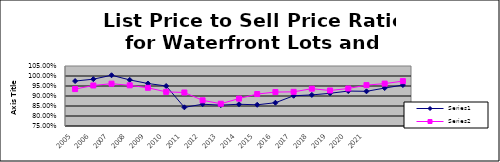
| Category | Series 0 | Series 1 |
|---|---|---|
| 2005.0 | 0.975 | 0.935 |
| 2006.0 | 0.984 | 0.953 |
| 2007.0 | 1.004 | 0.962 |
| 2008.0 | 0.98 | 0.954 |
| 2009.0 | 0.962 | 0.941 |
| 2010.0 | 0.95 | 0.921 |
| 2011.0 | 0.843 | 0.918 |
| 2012.0 | 0.859 | 0.878 |
| 2013.0 | 0.854 | 0.861 |
| 2014.0 | 0.859 | 0.887 |
| 2015.0 | 0.856 | 0.91 |
| 2016.0 | 0.866 | 0.92 |
| 2017.0 | 0.901 | 0.921 |
| 2018.0 | 0.905 | 0.937 |
| 2019.0 | 0.914 | 0.927 |
| 2020.0 | 0.925 | 0.938 |
| 2021.0 | 0.923 | 0.954 |